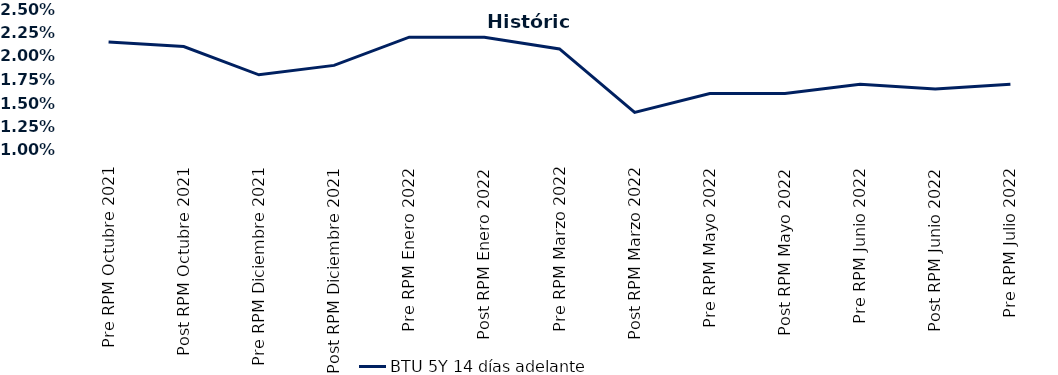
| Category | BTU 5Y 14 días adelante |
|---|---|
| Pre RPM Octubre 2021 | 0.022 |
| Post RPM Octubre 2021 | 0.021 |
| Pre RPM Diciembre 2021 | 0.018 |
| Post RPM Diciembre 2021 | 0.019 |
| Pre RPM Enero 2022 | 0.022 |
| Post RPM Enero 2022 | 0.022 |
| Pre RPM Marzo 2022 | 0.021 |
| Post RPM Marzo 2022 | 0.014 |
| Pre RPM Mayo 2022 | 0.016 |
| Post RPM Mayo 2022 | 0.016 |
| Pre RPM Junio 2022 | 0.017 |
| Post RPM Junio 2022 | 0.016 |
| Pre RPM Julio 2022 | 0.017 |